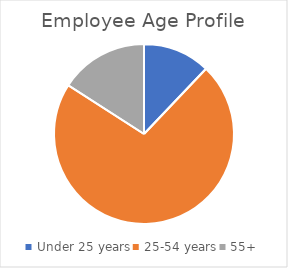
| Category | Series 0 |
|---|---|
| Under 25 years | 12.1 |
| 25-54 years | 72 |
| 55+ | 15.9 |